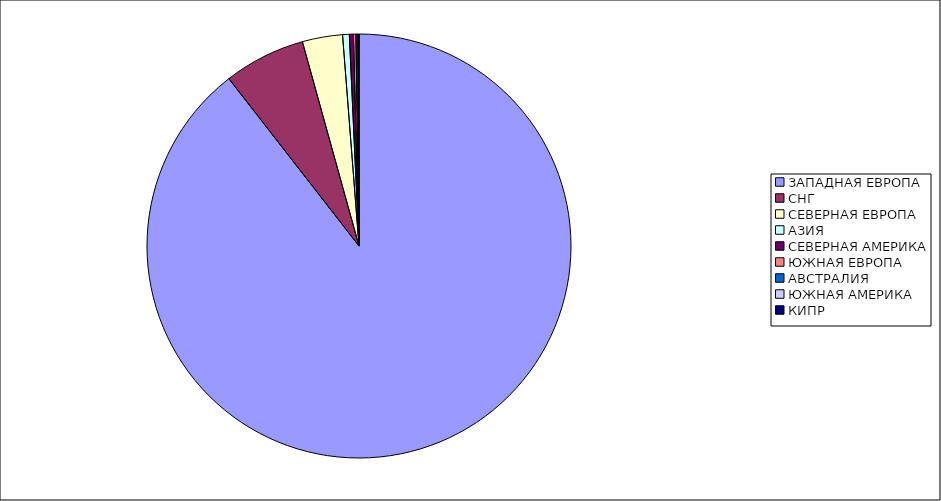
| Category | Оборот |
|---|---|
| ЗАПАДНАЯ ЕВРОПА | 0.895 |
| СНГ | 0.062 |
| СЕВЕРНАЯ ЕВРОПА | 0.031 |
| АЗИЯ | 0.005 |
| СЕВЕРНАЯ АМЕРИКА | 0.003 |
| ЮЖНАЯ ЕВРОПА | 0.002 |
| АВСТРАЛИЯ | 0.001 |
| ЮЖНАЯ АМЕРИКА | 0.001 |
| КИПР | 0 |